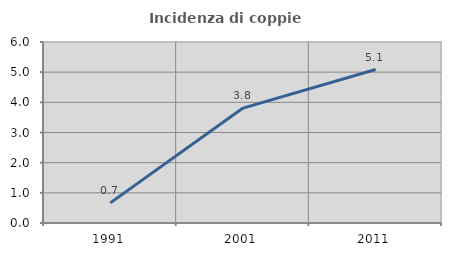
| Category | Incidenza di coppie miste |
|---|---|
| 1991.0 | 0.667 |
| 2001.0 | 3.81 |
| 2011.0 | 5.087 |